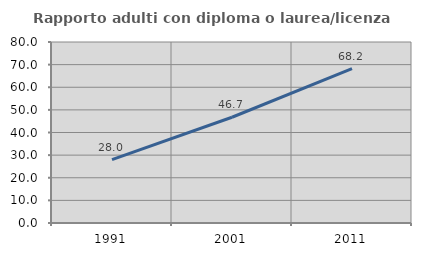
| Category | Rapporto adulti con diploma o laurea/licenza media  |
|---|---|
| 1991.0 | 28.024 |
| 2001.0 | 46.744 |
| 2011.0 | 68.243 |